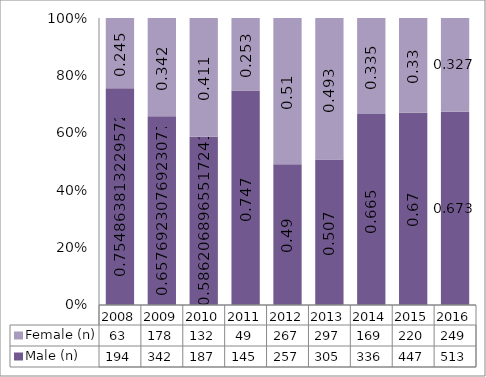
| Category | Male (n) | Female (n) |
|---|---|---|
| 2008.0 | 194 | 63 |
| 2009.0 | 342 | 178 |
| 2010.0 | 187 | 132 |
| 2011.0 | 145 | 49 |
| 2012.0 | 257 | 267 |
| 2013.0 | 305 | 297 |
| 2014.0 | 336 | 169 |
| 2015.0 | 447 | 220 |
| 2016.0 | 513 | 249 |